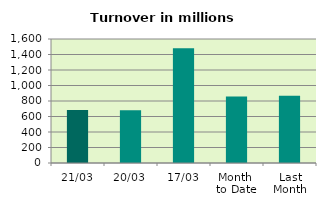
| Category | Series 0 |
|---|---|
| 21/03 | 682.794 |
| 20/03 | 681.148 |
| 17/03 | 1480.232 |
| Month 
to Date | 857.216 |
| Last
Month | 868.35 |